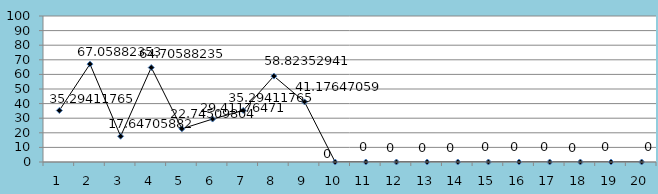
| Category | Series 0 |
|---|---|
| 0 | 35.294 |
| 1 | 67.059 |
| 2 | 17.647 |
| 3 | 64.706 |
| 4 | 22.745 |
| 5 | 29.412 |
| 6 | 35.294 |
| 7 | 58.824 |
| 8 | 41.176 |
| 9 | 0 |
| 10 | 0 |
| 11 | 0 |
| 12 | 0 |
| 13 | 0 |
| 14 | 0 |
| 15 | 0 |
| 16 | 0 |
| 17 | 0 |
| 18 | 0 |
| 19 | 0 |